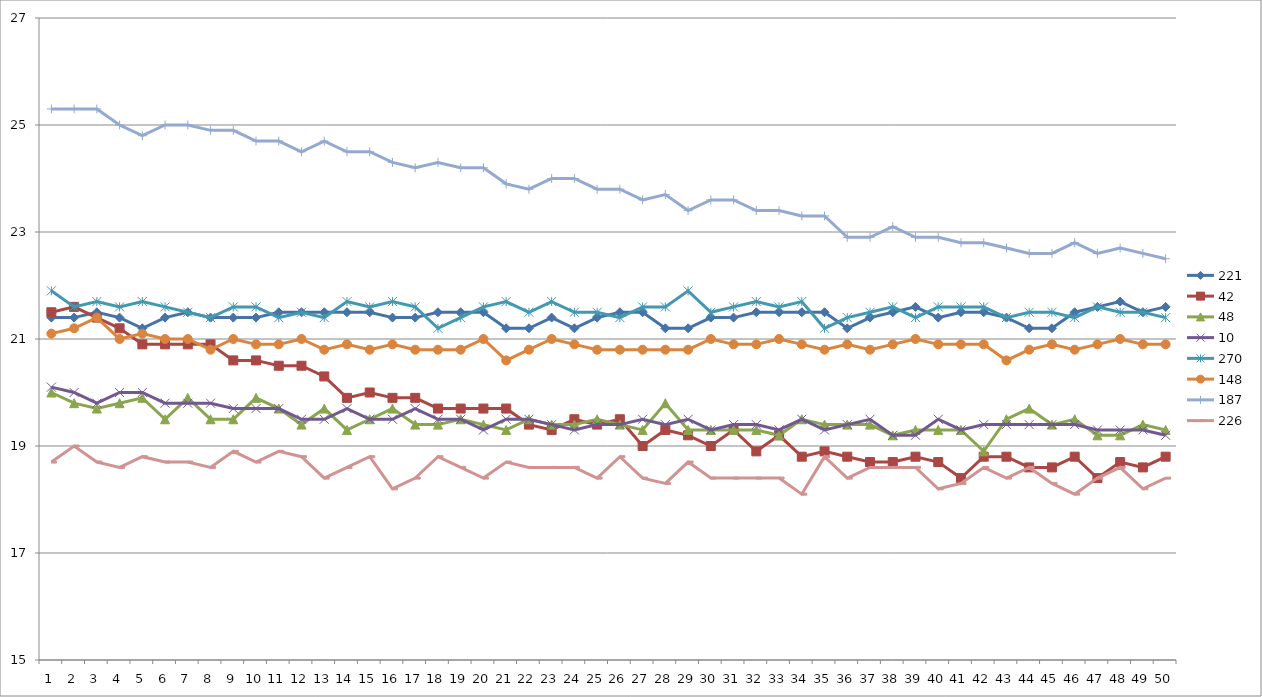
| Category | 221 | 42 | 48 | 10 | 270 | 148 | 187 | 226 |
|---|---|---|---|---|---|---|---|---|
| 0 | 21.4 | 21.5 | 20 | 20.1 | 21.9 | 21.1 | 25.3 | 18.7 |
| 1 | 21.4 | 21.6 | 19.8 | 20 | 21.6 | 21.2 | 25.3 | 19 |
| 2 | 21.5 | 21.4 | 19.7 | 19.8 | 21.7 | 21.4 | 25.3 | 18.7 |
| 3 | 21.4 | 21.2 | 19.8 | 20 | 21.6 | 21 | 25 | 18.6 |
| 4 | 21.2 | 20.9 | 19.9 | 20 | 21.7 | 21.1 | 24.8 | 18.8 |
| 5 | 21.4 | 20.9 | 19.5 | 19.8 | 21.6 | 21 | 25 | 18.7 |
| 6 | 21.5 | 20.9 | 19.9 | 19.8 | 21.5 | 21 | 25 | 18.7 |
| 7 | 21.4 | 20.9 | 19.5 | 19.8 | 21.4 | 20.8 | 24.9 | 18.6 |
| 8 | 21.4 | 20.6 | 19.5 | 19.7 | 21.6 | 21 | 24.9 | 18.9 |
| 9 | 21.4 | 20.6 | 19.9 | 19.7 | 21.6 | 20.9 | 24.7 | 18.7 |
| 10 | 21.5 | 20.5 | 19.7 | 19.7 | 21.4 | 20.9 | 24.7 | 18.9 |
| 11 | 21.5 | 20.5 | 19.4 | 19.5 | 21.5 | 21 | 24.5 | 18.8 |
| 12 | 21.5 | 20.3 | 19.7 | 19.5 | 21.4 | 20.8 | 24.7 | 18.4 |
| 13 | 21.5 | 19.9 | 19.3 | 19.7 | 21.7 | 20.9 | 24.5 | 18.6 |
| 14 | 21.5 | 20 | 19.5 | 19.5 | 21.6 | 20.8 | 24.5 | 18.8 |
| 15 | 21.4 | 19.9 | 19.7 | 19.5 | 21.7 | 20.9 | 24.3 | 18.2 |
| 16 | 21.4 | 19.9 | 19.4 | 19.7 | 21.6 | 20.8 | 24.2 | 18.4 |
| 17 | 21.5 | 19.7 | 19.4 | 19.5 | 21.2 | 20.8 | 24.3 | 18.8 |
| 18 | 21.5 | 19.7 | 19.5 | 19.5 | 21.4 | 20.8 | 24.2 | 18.6 |
| 19 | 21.5 | 19.7 | 19.4 | 19.3 | 21.6 | 21 | 24.2 | 18.4 |
| 20 | 21.2 | 19.7 | 19.3 | 19.5 | 21.7 | 20.6 | 23.9 | 18.7 |
| 21 | 21.2 | 19.4 | 19.5 | 19.5 | 21.5 | 20.8 | 23.8 | 18.6 |
| 22 | 21.4 | 19.3 | 19.4 | 19.4 | 21.7 | 21 | 24 | 18.6 |
| 23 | 21.2 | 19.5 | 19.4 | 19.3 | 21.5 | 20.9 | 24 | 18.6 |
| 24 | 21.4 | 19.4 | 19.5 | 19.4 | 21.5 | 20.8 | 23.8 | 18.4 |
| 25 | 21.5 | 19.5 | 19.4 | 19.4 | 21.4 | 20.8 | 23.8 | 18.8 |
| 26 | 21.5 | 19 | 19.3 | 19.5 | 21.6 | 20.8 | 23.6 | 18.4 |
| 27 | 21.2 | 19.3 | 19.8 | 19.4 | 21.6 | 20.8 | 23.7 | 18.3 |
| 28 | 21.2 | 19.2 | 19.3 | 19.5 | 21.9 | 20.8 | 23.4 | 18.7 |
| 29 | 21.4 | 19 | 19.3 | 19.3 | 21.5 | 21 | 23.6 | 18.4 |
| 30 | 21.4 | 19.3 | 19.3 | 19.4 | 21.6 | 20.9 | 23.6 | 18.4 |
| 31 | 21.5 | 18.9 | 19.3 | 19.4 | 21.7 | 20.9 | 23.4 | 18.4 |
| 32 | 21.5 | 19.2 | 19.2 | 19.3 | 21.6 | 21 | 23.4 | 18.4 |
| 33 | 21.5 | 18.8 | 19.5 | 19.5 | 21.7 | 20.9 | 23.3 | 18.1 |
| 34 | 21.5 | 18.9 | 19.4 | 19.3 | 21.2 | 20.8 | 23.3 | 18.8 |
| 35 | 21.2 | 18.8 | 19.4 | 19.4 | 21.4 | 20.9 | 22.9 | 18.4 |
| 36 | 21.4 | 18.7 | 19.4 | 19.5 | 21.5 | 20.8 | 22.9 | 18.6 |
| 37 | 21.5 | 18.7 | 19.2 | 19.2 | 21.6 | 20.9 | 23.1 | 18.6 |
| 38 | 21.6 | 18.8 | 19.3 | 19.2 | 21.4 | 21 | 22.9 | 18.6 |
| 39 | 21.4 | 18.7 | 19.3 | 19.5 | 21.6 | 20.9 | 22.9 | 18.2 |
| 40 | 21.5 | 18.4 | 19.3 | 19.3 | 21.6 | 20.9 | 22.8 | 18.3 |
| 41 | 21.5 | 18.8 | 18.9 | 19.4 | 21.6 | 20.9 | 22.8 | 18.6 |
| 42 | 21.4 | 18.8 | 19.5 | 19.4 | 21.4 | 20.6 | 22.7 | 18.4 |
| 43 | 21.2 | 18.6 | 19.7 | 19.4 | 21.5 | 20.8 | 22.6 | 18.6 |
| 44 | 21.2 | 18.6 | 19.4 | 19.4 | 21.5 | 20.9 | 22.6 | 18.3 |
| 45 | 21.5 | 18.8 | 19.5 | 19.4 | 21.4 | 20.8 | 22.8 | 18.1 |
| 46 | 21.6 | 18.4 | 19.2 | 19.3 | 21.6 | 20.9 | 22.6 | 18.4 |
| 47 | 21.7 | 18.7 | 19.2 | 19.3 | 21.5 | 21 | 22.7 | 18.6 |
| 48 | 21.5 | 18.6 | 19.4 | 19.3 | 21.5 | 20.9 | 22.6 | 18.2 |
| 49 | 21.6 | 18.8 | 19.3 | 19.2 | 21.4 | 20.9 | 22.5 | 18.4 |